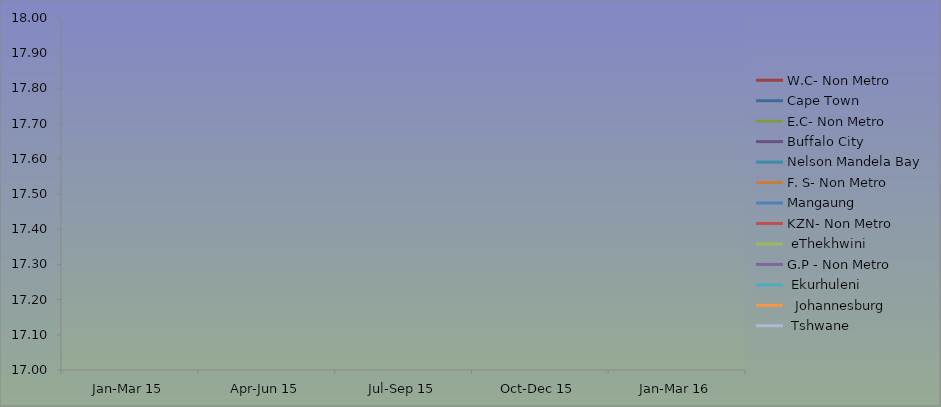
| Category | W.C- Non Metro | Cape Town | E.C- Non Metro | Buffalo City | Nelson Mandela Bay | F. S- Non Metro | Mangaung | KZN- Non Metro |  eThekhwini | G.P - Non Metro |  Ekurhuleni |   Johannesburg |  Tshwane |
|---|---|---|---|---|---|---|---|---|---|---|---|---|---|
| Jan-Mar 15 | 2.547 | 5.335 | 8.62 | 1.206 | 2.011 | 4.248 | 1.48 | 12.988 | 5.034 | 3.969 | 7.465 | 9.407 | 6.554 |
| Apr-Jun 15 | 3.202 | 5.339 | 8.619 | 1.382 | 2.071 | 4.47 | 1.594 | 12.708 | 4.698 | 4.122 | 7.461 | 9.407 | 6.027 |
| Jul-Sep 15 | 3.037 | 5.355 | 8.919 | 1.151 | 2.151 | 4.332 | 1.468 | 12.667 | 4.477 | 4.027 | 7.462 | 10.124 | 6.032 |
| Oct-Dec 15 | 3.065 | 5.149 | 8.658 | 1.124 | 1.86 | 4.407 | 1.338 | 13.578 | 4.416 | 3.735 | 7.566 | 9.803 | 5.826 |
| Jan-Mar 16 | 3.151 | 4.714 | 9.16 | 1.204 | 1.935 | 4.341 | 1.417 | 13.949 | 4.093 | 4.157 | 7.654 | 9.739 | 5.794 |